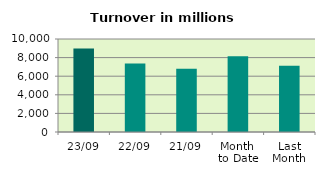
| Category | Series 0 |
|---|---|
| 23/09 | 8982.08 |
| 22/09 | 7371.594 |
| 21/09 | 6791.81 |
| Month 
to Date | 8133.664 |
| Last
Month | 7128.729 |